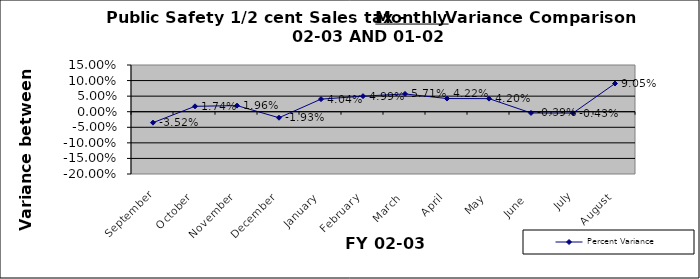
| Category | Percent Variance |
|---|---|
| September | -0.035 |
| October | 0.017 |
| November | 0.02 |
| December | -0.019 |
| January | 0.04 |
| February | 0.05 |
| March | 0.057 |
| April | 0.042 |
| May | 0.042 |
| June  | -0.004 |
| July | -0.004 |
| August | 0.091 |